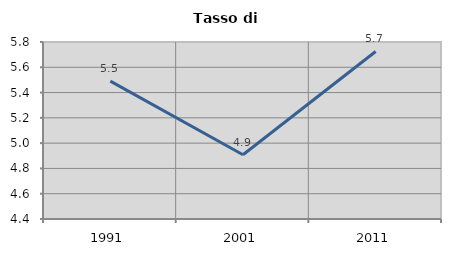
| Category | Tasso di disoccupazione   |
|---|---|
| 1991.0 | 5.491 |
| 2001.0 | 4.908 |
| 2011.0 | 5.725 |